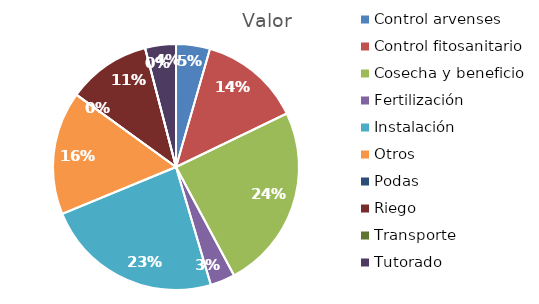
| Category | Valor |
|---|---|
| Control arvenses | 550000 |
| Control fitosanitario | 1650000 |
| Cosecha y beneficio | 3000600 |
| Fertilización | 400000 |
| Instalación | 2880316 |
| Otros | 2000000 |
| Podas | 0 |
| Riego | 1350000 |
| Transporte | 0 |
| Tutorado | 500000 |